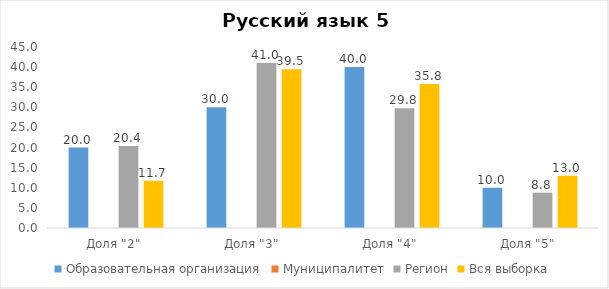
| Category | Образовательная организация | Муниципалитет | Регион | Вся выборка |
|---|---|---|---|---|
| Доля "2" | 20 |  | 20.4 | 11.74 |
| Доля "3" | 30 |  | 41.03 | 39.45 |
| Доля "4" | 40 |  | 29.79 | 35.82 |
| Доля "5" | 10 |  | 8.78 | 12.99 |